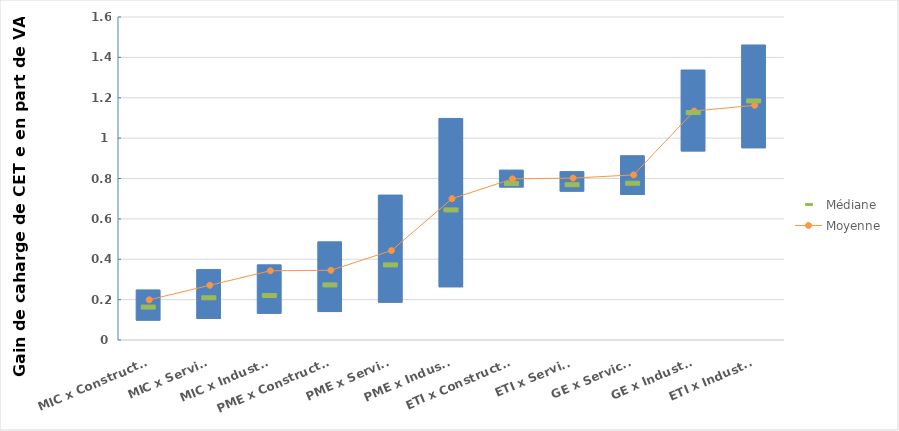
| Category | lower | upper |
|---|---|---|
| MIC x Construction | 0.096 | 0.152 |
| MIC x Services | 0.104 | 0.245 |
| MIC x Industrie | 0.13 | 0.242 |
| PME x Construction | 0.138 | 0.348 |
| PME x Services | 0.185 | 0.533 |
| PME x Industrie | 0.261 | 0.836 |
| ETI x Construction | 0.755 | 0.086 |
| ETI x Services | 0.735 | 0.099 |
| GE x Services | 0.719 | 0.194 |
| GE x Industrie | 0.934 | 0.403 |
| ETI x Industrie | 0.95 | 0.512 |